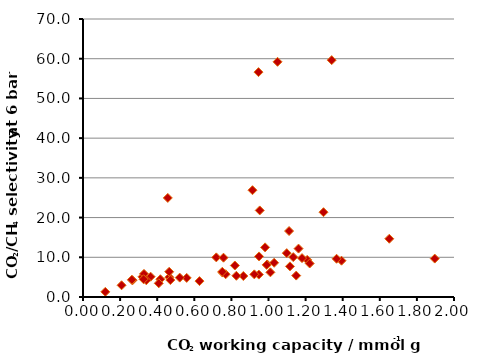
| Category | Series 0 |
|---|---|
| 0.8643035569740156 | 5.286 |
| 1.3936477788410762 | 9.138 |
| 0.3207846580553178 | 5.092 |
| 0.9460577455216648 | 56.626 |
| 0.3644763664733718 | 5.118 |
| 0.4170574993776927 | 4.475 |
| 0.9528014233314296 | 21.797 |
| 0.3287851831442357 | 5.821 |
| 0.9480204612472896 | 5.638 |
| 1.0103349424553778 | 6.212 |
| 1.208541776686599 | 9.342 |
| 0.9931955747113242 | 8.193 |
| 1.180809076330052 | 9.791 |
| 1.8962611161132594 | 9.674 |
| 1.0487817422309984 | 59.22 |
| 0.4571317619206936 | 24.944 |
| 0.26661154918633545 | 4.198 |
| 0.8186828345398625 | 7.93 |
| 0.9136497424576893 | 26.888 |
| 0.12029122739177711 | 1.296 |
| 1.0305558718506576 | 8.623 |
| 0.9490649587063076 | 10.215 |
| 1.1157245582763182 | 7.708 |
| 1.2221664810678248 | 8.437 |
| 0.4650978173624786 | 4.988 |
| 0.752098212219383 | 6.155 |
| 0.5590301649597404 | 4.805 |
| 0.40831980976528714 | 3.452 |
| 1.3406793163621096 | 59.649 |
| 1.0984501972796332 | 11.038 |
| 0.34128943907055165 | 4.208 |
| 0.718747340235873 | 9.978 |
| 0.47105858889391833 | 4.263 |
| 1.6510990043059477 | 14.668 |
| 0.9899591072085243 | 8.09 |
| 0.826726619329395 | 5.341 |
| 1.1108274253996524 | 16.609 |
| 0.2635954776887778 | 4.359 |
| 0.9816948068268667 | 12.5 |
| 1.1619955261522161 | 12.19 |
| 0.7574202590110652 | 9.892 |
| 1.1492805140623241 | 5.393 |
| 0.32641186494581825 | 4.472 |
| 0.6279711268259014 | 4.005 |
| 0.7690207515359054 | 5.732 |
| 0.5213593470565316 | 4.88 |
| 1.366969402568535 | 9.625 |
| 0.9236409301003052 | 5.705 |
| 1.1333961107521224 | 10.04 |
| 1.2965601174876202 | 21.348 |
| 0.7508943549889007 | 6.354 |
| 0.20791737446915573 | 2.953 |
| 0.464907486391696 | 6.356 |